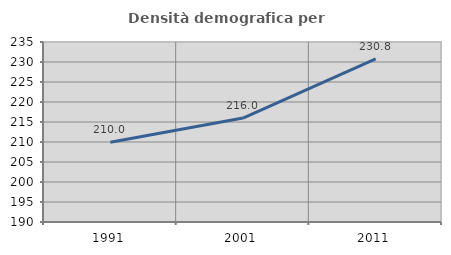
| Category | Densità demografica |
|---|---|
| 1991.0 | 209.959 |
| 2001.0 | 215.981 |
| 2011.0 | 230.789 |